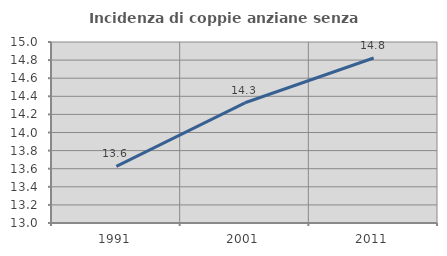
| Category | Incidenza di coppie anziane senza figli  |
|---|---|
| 1991.0 | 13.625 |
| 2001.0 | 14.328 |
| 2011.0 | 14.823 |